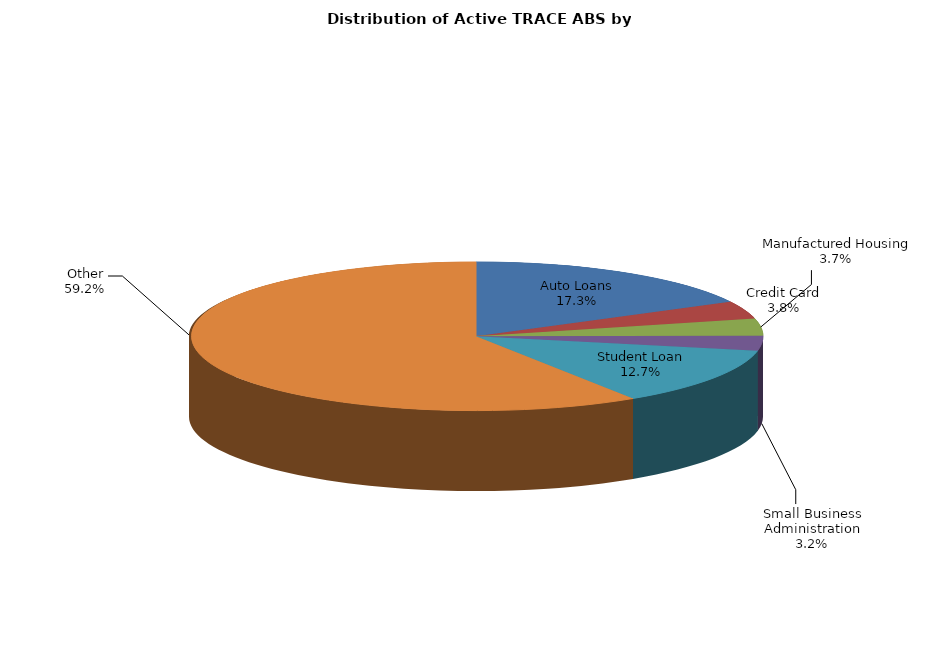
| Category | Series 0 |
|---|---|
| Auto Loans | 1749 |
| Credit Card | 389 |
| Manufactured Housing | 376 |
| Small Business Administration | 326 |
| Student Loan | 1283 |
| Other | 5985 |